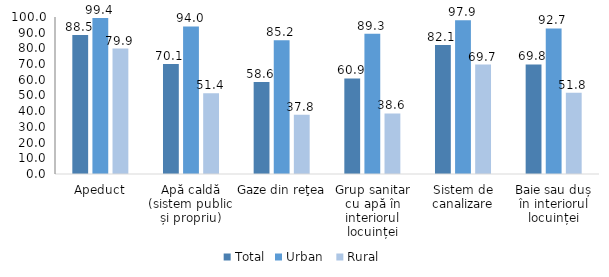
| Category | Total | Urban  | Rural |
|---|---|---|---|
| Apeduct | 88.5 | 99.4 | 79.9 |
| Apă caldă (sistem public și propriu) | 70.1 | 94 | 51.4 |
| Gaze din reţea | 58.6 | 85.2 | 37.8 |
| Grup sanitar cu apă în interiorul locuinței | 60.9 | 89.3 | 38.6 |
| Sistem de canalizare | 82.1 | 97.9 | 69.7 |
| Baie sau duș în interiorul locuinței | 69.805 | 92.712 | 51.824 |